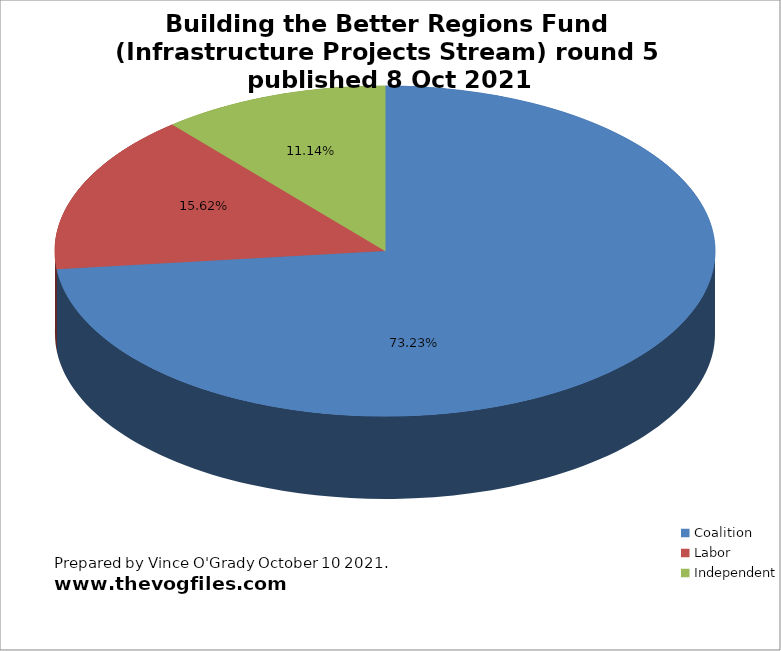
| Category | Building the better regions fund Infrasturcture Projects stream round 5 awards 8 Oct 2021 |
|---|---|
| Coalition | 0.732 |
| Labor | 0.156 |
| Independent | 0.111 |